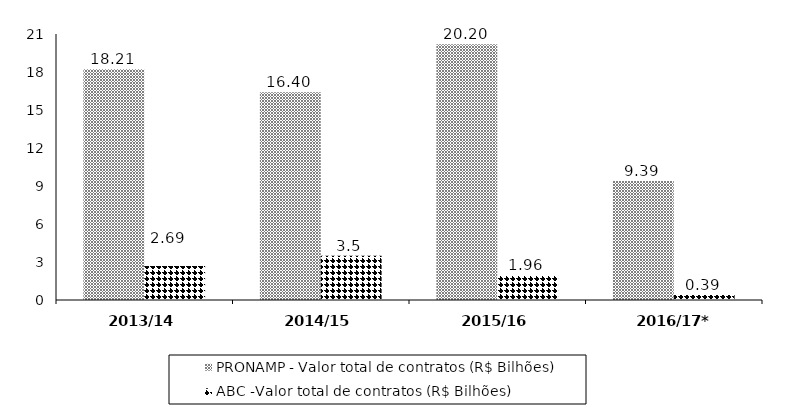
| Category | PRONAMP - Valor total de contratos (R$ Bilhões) | ABC -Valor total de contratos (R$ Bilhões) |
|---|---|---|
| 2013/14 | 18.21 | 2.69 |
| 2014/15 | 16.4 | 3.5 |
| 2015/16 | 20.199 | 1.96 |
| 2016/17* | 9.39 | 0.39 |